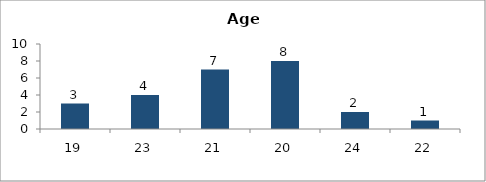
| Category | Age |
|---|---|
| 19.0 | 3 |
| 23.0 | 4 |
| 21.0 | 7 |
| 20.0 | 8 |
| 24.0 | 2 |
| 22.0 | 1 |